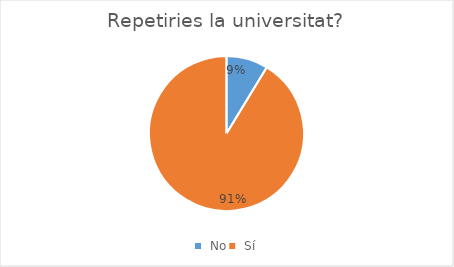
| Category | Series 0 |
|---|---|
|  No | 10 |
|  Sí | 105 |